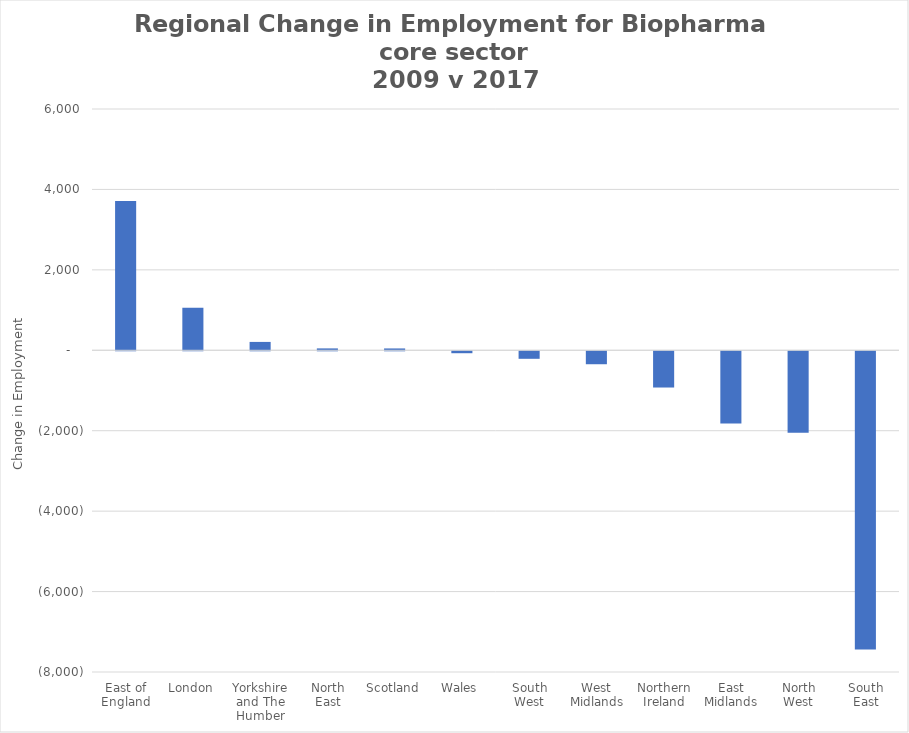
| Category | Change in Employment for Biopharma core  2009 to 2017 |
|---|---|
| East of England | 3715 |
| London | 1057 |
| Yorkshire and The Humber | 208 |
| North East | 47 |
| Scotland | 46 |
| Wales | -48 |
| South West | -187 |
| West Midlands | -322 |
| Northern Ireland | -901 |
| East Midlands | -1798 |
| North West | -2028 |
| South East | -7414 |